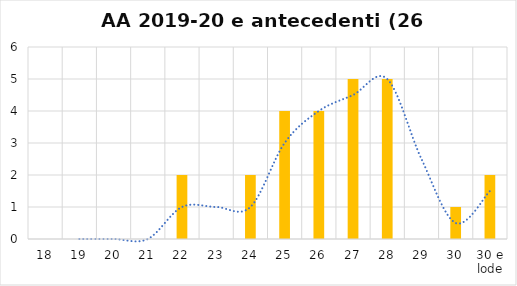
| Category | Series 0 |
|---|---|
| 18 | 0 |
| 19 | 0 |
| 20 | 0 |
| 21 | 0 |
| 22 | 2 |
| 23 | 0 |
| 24 | 2 |
| 25 | 4 |
| 26 | 4 |
| 27 | 5 |
| 28 | 5 |
| 29 | 0 |
| 30 | 1 |
| 30 e lode | 2 |